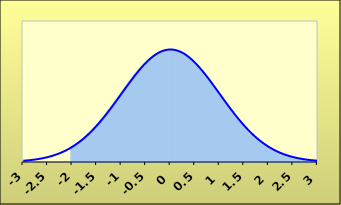
| Category | Series 1 |
|---|---|
| -3.0 | 0 |
| -2.9875 | 0 |
| -2.975 | 0 |
| -2.9625 | 0 |
| -2.95 | 0 |
| -2.9375 | 0 |
| -2.925 | 0 |
| -2.9125 | 0 |
| -2.9 | 0 |
| -2.8875 | 0 |
| -2.875 | 0 |
| -2.8625 | 0 |
| -2.85 | 0 |
| -2.8375 | 0 |
| -2.825 | 0 |
| -2.8125 | 0 |
| -2.8 | 0 |
| -2.7875 | 0 |
| -2.775 | 0 |
| -2.7625 | 0 |
| -2.75 | 0 |
| -2.7375 | 0 |
| -2.725 | 0 |
| -2.7125 | 0 |
| -2.7 | 0 |
| -2.6875 | 0 |
| -2.675 | 0 |
| -2.6625 | 0 |
| -2.65 | 0 |
| -2.6375 | 0 |
| -2.625 | 0 |
| -2.6125 | 0 |
| -2.6 | 0 |
| -2.5875 | 0 |
| -2.575 | 0 |
| -2.5625 | 0 |
| -2.55 | 0 |
| -2.5375 | 0 |
| -2.525 | 0 |
| -2.5125 | 0 |
| -2.5 | 0 |
| -2.4875 | 0 |
| -2.475 | 0 |
| -2.4625 | 0 |
| -2.45 | 0 |
| -2.4375 | 0 |
| -2.425 | 0 |
| -2.4125 | 0 |
| -2.4 | 0 |
| -2.3875 | 0 |
| -2.375 | 0 |
| -2.3625 | 0 |
| -2.35 | 0 |
| -2.3375 | 0 |
| -2.325 | 0 |
| -2.3125 | 0 |
| -2.3 | 0 |
| -2.2875 | 0 |
| -2.275 | 0 |
| -2.2625 | 0 |
| -2.25 | 0 |
| -2.2375 | 0 |
| -2.225 | 0 |
| -2.2125 | 0 |
| -2.2 | 0 |
| -2.1875 | 0 |
| -2.175 | 0 |
| -2.1625 | 0 |
| -2.15 | 0 |
| -2.1375 | 0 |
| -2.125 | 0 |
| -2.1125 | 0 |
| -2.1 | 0 |
| -2.0875 | 0 |
| -2.075 | 0 |
| -2.0625 | 0 |
| -2.05 | 0 |
| -2.0375 | 0 |
| -2.025 | 0 |
| -2.0125 | 0 |
| -2.0 | 0.054 |
| -1.9875 | 0.055 |
| -1.975 | 0.057 |
| -1.9625 | 0.058 |
| -1.95 | 0.06 |
| -1.9375 | 0.061 |
| -1.925 | 0.063 |
| -1.9125 | 0.064 |
| -1.9 | 0.066 |
| -1.8875 | 0.067 |
| -1.875 | 0.069 |
| -1.8625 | 0.07 |
| -1.85 | 0.072 |
| -1.8375 | 0.074 |
| -1.825 | 0.075 |
| -1.8125 | 0.077 |
| -1.8 | 0.079 |
| -1.7875 | 0.081 |
| -1.775 | 0.083 |
| -1.7625 | 0.084 |
| -1.75 | 0.086 |
| -1.7375 | 0.088 |
| -1.725 | 0.09 |
| -1.7125 | 0.092 |
| -1.7 | 0.094 |
| -1.6875 | 0.096 |
| -1.675 | 0.098 |
| -1.6625 | 0.1 |
| -1.65 | 0.102 |
| -1.6375 | 0.104 |
| -1.625 | 0.107 |
| -1.6125 | 0.109 |
| -1.6 | 0.111 |
| -1.5875 | 0.113 |
| -1.575 | 0.115 |
| -1.5625 | 0.118 |
| -1.55 | 0.12 |
| -1.5375 | 0.122 |
| -1.525 | 0.125 |
| -1.5125 | 0.127 |
| -1.5 | 0.13 |
| -1.4875 | 0.132 |
| -1.475 | 0.134 |
| -1.4625 | 0.137 |
| -1.45 | 0.139 |
| -1.4375 | 0.142 |
| -1.425 | 0.145 |
| -1.4125 | 0.147 |
| -1.4 | 0.15 |
| -1.3875 | 0.152 |
| -1.375 | 0.155 |
| -1.3625 | 0.158 |
| -1.35 | 0.16 |
| -1.3375 | 0.163 |
| -1.325 | 0.166 |
| -1.3125 | 0.169 |
| -1.3 | 0.171 |
| -1.2875 | 0.174 |
| -1.275 | 0.177 |
| -1.2625 | 0.18 |
| -1.25 | 0.183 |
| -1.2375 | 0.186 |
| -1.225 | 0.188 |
| -1.2125 | 0.191 |
| -1.2 | 0.194 |
| -1.1875 | 0.197 |
| -1.175 | 0.2 |
| -1.1625 | 0.203 |
| -1.15 | 0.206 |
| -1.1375 | 0.209 |
| -1.125 | 0.212 |
| -1.1125 | 0.215 |
| -1.1 | 0.218 |
| -1.0875 | 0.221 |
| -1.075 | 0.224 |
| -1.0625 | 0.227 |
| -1.05 | 0.23 |
| -1.0375 | 0.233 |
| -1.025 | 0.236 |
| -1.0125 | 0.239 |
| -1.0 | 0.242 |
| -0.9875 | 0.245 |
| -0.975 | 0.248 |
| -0.9625 | 0.251 |
| -0.95 | 0.254 |
| -0.9375 | 0.257 |
| -0.925 | 0.26 |
| -0.9125 | 0.263 |
| -0.9 | 0.266 |
| -0.8875 | 0.269 |
| -0.875 | 0.272 |
| -0.8625 | 0.275 |
| -0.85 | 0.278 |
| -0.8375 | 0.281 |
| -0.825 | 0.284 |
| -0.8125 | 0.287 |
| -0.8 | 0.29 |
| -0.7875 | 0.293 |
| -0.775 | 0.295 |
| -0.7625 | 0.298 |
| -0.75 | 0.301 |
| -0.7375 | 0.304 |
| -0.725 | 0.307 |
| -0.7125 | 0.31 |
| -0.7 | 0.312 |
| -0.6875 | 0.315 |
| -0.675 | 0.318 |
| -0.6625 | 0.32 |
| -0.65 | 0.323 |
| -0.6375 | 0.326 |
| -0.625 | 0.328 |
| -0.6125 | 0.331 |
| -0.6 | 0.333 |
| -0.5875 | 0.336 |
| -0.575 | 0.338 |
| -0.5625 | 0.341 |
| -0.55 | 0.343 |
| -0.5375 | 0.345 |
| -0.525 | 0.348 |
| -0.5125 | 0.35 |
| -0.5 | 0.352 |
| -0.4875 | 0.354 |
| -0.475 | 0.356 |
| -0.4625 | 0.358 |
| -0.45 | 0.361 |
| -0.4375 | 0.363 |
| -0.425 | 0.364 |
| -0.4125 | 0.366 |
| -0.4 | 0.368 |
| -0.3875 | 0.37 |
| -0.375 | 0.372 |
| -0.3625 | 0.374 |
| -0.35 | 0.375 |
| -0.3375 | 0.377 |
| -0.325 | 0.378 |
| -0.3125 | 0.38 |
| -0.3 | 0.381 |
| -0.2875 | 0.383 |
| -0.275 | 0.384 |
| -0.2625 | 0.385 |
| -0.25 | 0.387 |
| -0.2375 | 0.388 |
| -0.225 | 0.389 |
| -0.2125 | 0.39 |
| -0.2 | 0.391 |
| -0.1875 | 0.392 |
| -0.175 | 0.393 |
| -0.1625 | 0.394 |
| -0.15 | 0.394 |
| -0.1375 | 0.395 |
| -0.125 | 0.396 |
| -0.1125 | 0.396 |
| -0.1 | 0.397 |
| -0.0875 | 0.397 |
| -0.075 | 0.398 |
| -0.0625 | 0.398 |
| -0.05 | 0.398 |
| -0.0375 | 0.399 |
| -0.025 | 0.399 |
| -0.0125 | 0.399 |
| 0.0 | 0.399 |
| 0.0125 | 0.399 |
| 0.025 | 0.399 |
| 0.0375 | 0.399 |
| 0.05 | 0.398 |
| 0.0625 | 0.398 |
| 0.075 | 0.398 |
| 0.0875 | 0.397 |
| 0.1 | 0.397 |
| 0.1125 | 0.396 |
| 0.125 | 0.396 |
| 0.1375 | 0.395 |
| 0.15 | 0.394 |
| 0.1625 | 0.394 |
| 0.175 | 0.393 |
| 0.1875 | 0.392 |
| 0.2 | 0.391 |
| 0.2125 | 0.39 |
| 0.225 | 0.389 |
| 0.2375 | 0.388 |
| 0.25 | 0.387 |
| 0.2625 | 0.385 |
| 0.275 | 0.384 |
| 0.2875 | 0.383 |
| 0.3 | 0.381 |
| 0.3125 | 0.38 |
| 0.325 | 0.378 |
| 0.3375 | 0.377 |
| 0.35 | 0.375 |
| 0.3625 | 0.374 |
| 0.375 | 0.372 |
| 0.3875 | 0.37 |
| 0.4 | 0.368 |
| 0.4125 | 0.366 |
| 0.425 | 0.364 |
| 0.4375 | 0.363 |
| 0.45 | 0.361 |
| 0.4625 | 0.358 |
| 0.475 | 0.356 |
| 0.4875 | 0.354 |
| 0.5 | 0.352 |
| 0.5125 | 0.35 |
| 0.525 | 0.348 |
| 0.5375 | 0.345 |
| 0.55 | 0.343 |
| 0.5625 | 0.341 |
| 0.575 | 0.338 |
| 0.5875 | 0.336 |
| 0.6 | 0.333 |
| 0.6125 | 0.331 |
| 0.625 | 0.328 |
| 0.6375 | 0.326 |
| 0.65 | 0.323 |
| 0.6625 | 0.32 |
| 0.675 | 0.318 |
| 0.6875 | 0.315 |
| 0.7 | 0.312 |
| 0.7125 | 0.31 |
| 0.725 | 0.307 |
| 0.7375 | 0.304 |
| 0.75 | 0.301 |
| 0.7625 | 0.298 |
| 0.775 | 0.295 |
| 0.7875 | 0.293 |
| 0.8 | 0.29 |
| 0.8125 | 0.287 |
| 0.825 | 0.284 |
| 0.8375 | 0.281 |
| 0.85 | 0.278 |
| 0.8625 | 0.275 |
| 0.875 | 0.272 |
| 0.8875 | 0.269 |
| 0.9 | 0.266 |
| 0.9125 | 0.263 |
| 0.925 | 0.26 |
| 0.9375 | 0.257 |
| 0.95 | 0.254 |
| 0.9625 | 0.251 |
| 0.975 | 0.248 |
| 0.9875 | 0.245 |
| 1.0 | 0.242 |
| 1.0125 | 0.239 |
| 1.025 | 0.236 |
| 1.0375 | 0.233 |
| 1.05 | 0.23 |
| 1.0625 | 0.227 |
| 1.075 | 0.224 |
| 1.0875 | 0.221 |
| 1.1 | 0.218 |
| 1.1125 | 0.215 |
| 1.125 | 0.212 |
| 1.1375 | 0.209 |
| 1.15 | 0.206 |
| 1.1625 | 0.203 |
| 1.175 | 0.2 |
| 1.1875 | 0.197 |
| 1.2 | 0.194 |
| 1.2125 | 0.191 |
| 1.225 | 0.188 |
| 1.2375 | 0.186 |
| 1.25 | 0.183 |
| 1.2625 | 0.18 |
| 1.275 | 0.177 |
| 1.2875 | 0.174 |
| 1.3 | 0.171 |
| 1.3125 | 0.169 |
| 1.325 | 0.166 |
| 1.3375 | 0.163 |
| 1.35 | 0.16 |
| 1.3625 | 0.158 |
| 1.375 | 0.155 |
| 1.3875 | 0.152 |
| 1.4 | 0.15 |
| 1.4125 | 0.147 |
| 1.425 | 0.145 |
| 1.4375 | 0.142 |
| 1.45 | 0.139 |
| 1.4625 | 0.137 |
| 1.475 | 0.134 |
| 1.4875 | 0.132 |
| 1.5 | 0.13 |
| 1.5125 | 0.127 |
| 1.525 | 0.125 |
| 1.5375 | 0.122 |
| 1.55 | 0.12 |
| 1.5625 | 0.118 |
| 1.575 | 0.115 |
| 1.5875 | 0.113 |
| 1.6 | 0.111 |
| 1.6125 | 0.109 |
| 1.625 | 0.107 |
| 1.6375 | 0.104 |
| 1.65 | 0.102 |
| 1.6625 | 0.1 |
| 1.675 | 0.098 |
| 1.6875 | 0.096 |
| 1.7 | 0.094 |
| 1.7125 | 0.092 |
| 1.725 | 0.09 |
| 1.7375 | 0.088 |
| 1.75 | 0.086 |
| 1.7625 | 0.084 |
| 1.775 | 0.083 |
| 1.7875 | 0.081 |
| 1.8 | 0.079 |
| 1.8125 | 0.077 |
| 1.825 | 0.075 |
| 1.8375 | 0.074 |
| 1.85 | 0.072 |
| 1.8625 | 0.07 |
| 1.875 | 0.069 |
| 1.8875 | 0.067 |
| 1.9 | 0.066 |
| 1.9125 | 0.064 |
| 1.925 | 0.063 |
| 1.9375 | 0.061 |
| 1.95 | 0.06 |
| 1.9625 | 0.058 |
| 1.975 | 0.057 |
| 1.9875 | 0.055 |
| 2.0 | 0.054 |
| 2.0125 | 0.053 |
| 2.025 | 0.051 |
| 2.0375 | 0.05 |
| 2.05 | 0.049 |
| 2.0625 | 0.048 |
| 2.075 | 0.046 |
| 2.0875 | 0.045 |
| 2.1 | 0.044 |
| 2.1125 | 0.043 |
| 2.125 | 0.042 |
| 2.1375 | 0.041 |
| 2.15 | 0.04 |
| 2.1625 | 0.038 |
| 2.175 | 0.037 |
| 2.1875 | 0.036 |
| 2.2 | 0.035 |
| 2.2125 | 0.035 |
| 2.225 | 0.034 |
| 2.2375 | 0.033 |
| 2.25 | 0.032 |
| 2.2625 | 0.031 |
| 2.275 | 0.03 |
| 2.2875 | 0.029 |
| 2.3 | 0.028 |
| 2.3125 | 0.028 |
| 2.325 | 0.027 |
| 2.3375 | 0.026 |
| 2.35 | 0.025 |
| 2.3625 | 0.024 |
| 2.375 | 0.024 |
| 2.3875 | 0.023 |
| 2.4 | 0.022 |
| 2.4125 | 0.022 |
| 2.425 | 0.021 |
| 2.4375 | 0.02 |
| 2.45 | 0.02 |
| 2.4625 | 0.019 |
| 2.475 | 0.019 |
| 2.4875 | 0.018 |
| 2.5 | 0.018 |
| 2.5125 | 0.017 |
| 2.525 | 0.016 |
| 2.5375 | 0.016 |
| 2.55 | 0.015 |
| 2.5625 | 0.015 |
| 2.575 | 0.014 |
| 2.5875 | 0.014 |
| 2.6 | 0.014 |
| 2.6125 | 0.013 |
| 2.625 | 0.013 |
| 2.6375 | 0.012 |
| 2.65 | 0.012 |
| 2.6625 | 0.012 |
| 2.675 | 0.011 |
| 2.6875 | 0.011 |
| 2.7 | 0.01 |
| 2.7125 | 0.01 |
| 2.725 | 0.01 |
| 2.7375 | 0.009 |
| 2.75 | 0.009 |
| 2.7625 | 0.009 |
| 2.775 | 0.008 |
| 2.7875 | 0.008 |
| 2.8 | 0.008 |
| 2.8125 | 0.008 |
| 2.825 | 0.007 |
| 2.8375 | 0.007 |
| 2.85 | 0.007 |
| 2.8625 | 0.007 |
| 2.875 | 0.006 |
| 2.8875 | 0.006 |
| 2.9 | 0.006 |
| 2.9125 | 0.006 |
| 2.925 | 0.006 |
| 2.9375 | 0.005 |
| 2.95 | 0.005 |
| 2.9625 | 0.005 |
| 2.975 | 0.005 |
| 2.9875 | 0.005 |
| 3.0 | 0.004 |